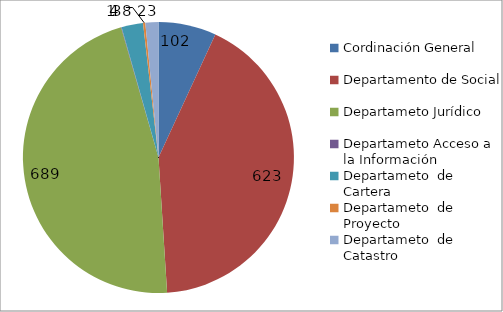
| Category | Series 0 |
|---|---|
| Cordinación General | 102 |
| Departamento de Social | 623 |
| Departameto Jurídico  | 689 |
| Departameto Acceso a la Información  | 1 |
| Departameto  de Cartera | 38 |
| Departameto  de Proyecto | 4 |
| Departameto  de Catastro | 23 |